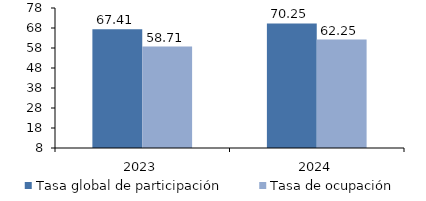
| Category | Tasa global de participación | Tasa de ocupación |
|---|---|---|
| 2023.0 | 67.408 | 58.706 |
| 2024.0 | 70.254 | 62.249 |